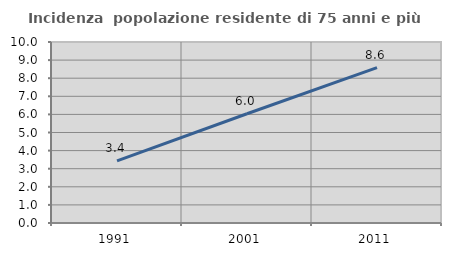
| Category | Incidenza  popolazione residente di 75 anni e più |
|---|---|
| 1991.0 | 3.432 |
| 2001.0 | 6.035 |
| 2011.0 | 8.588 |